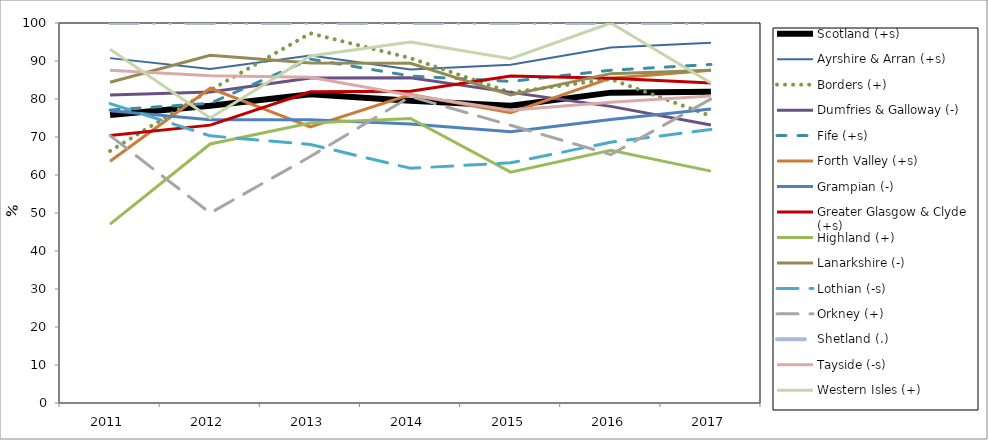
| Category | Scotland (+s) | Ayrshire & Arran (+s) | Borders (+) | Dumfries & Galloway (-) | Fife (+s) | Forth Valley (+s) | Grampian (-) | Greater Glasgow & Clyde (+s) | Highland (+) | Lanarkshire (-) | Lothian (-s) | Orkney (+) | Shetland (.) | Tayside (-s) | Western Isles (+) |
|---|---|---|---|---|---|---|---|---|---|---|---|---|---|---|---|
| 2011.0 | 75.775 | 90.758 | 66.31 | 81.057 | 77.098 | 63.616 | 76.895 | 70.38 | 47.074 | 84.409 | 78.795 | 70.37 | 100 | 87.546 | 93.103 |
| 2012.0 | 78.196 | 87.922 | 82.32 | 81.818 | 78.864 | 82.816 | 74.539 | 73.121 | 68.158 | 91.518 | 70.302 | 50 | 100 | 86.146 | 75 |
| 2013.0 | 81.274 | 91.457 | 97.283 | 85.547 | 90.497 | 72.682 | 74.567 | 81.914 | 73.684 | 89.5 | 68.036 | 64.865 | 100 | 85.714 | 91.304 |
| 2014.0 | 79.569 | 87.759 | 90.751 | 85.597 | 86.047 | 81.149 | 73.422 | 82.017 | 74.87 | 89.383 | 61.765 | 80.645 | 100 | 80.962 | 95 |
| 2015.0 | 78.225 | 89.029 | 81.726 | 81.743 | 84.631 | 76.375 | 71.365 | 86.051 | 60.743 | 81.094 | 63.208 | 73.077 | 100 | 77.069 | 90.625 |
| 2016.0 | 81.675 | 93.526 | 85.227 | 78.061 | 87.572 | 85.477 | 74.594 | 85.436 | 66.48 | 86.675 | 68.638 | 65.385 | 100 | 79.148 | 100 |
| 2017.0 | 81.928 | 94.774 | 75.524 | 73.182 | 89.087 | 87.554 | 77.341 | 84.22 | 61.022 | 87.586 | 71.95 | 80 | 100 | 80.769 | 84.211 |